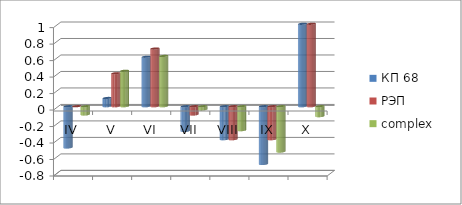
| Category | КП 68 | РЭП  | complex |
|---|---|---|---|
| IV | -0.5 | 0 | -0.1 |
| V | 0.1 | 0.4 | 0.43 |
| VI | 0.6 | 0.7 | 0.61 |
| VII | -0.3 | -0.1 | -0.04 |
| VIII | -0.4 | -0.4 | -0.29 |
| IX | -0.7 | -0.4 | -0.55 |
| X | 1 | 1 | -0.12 |